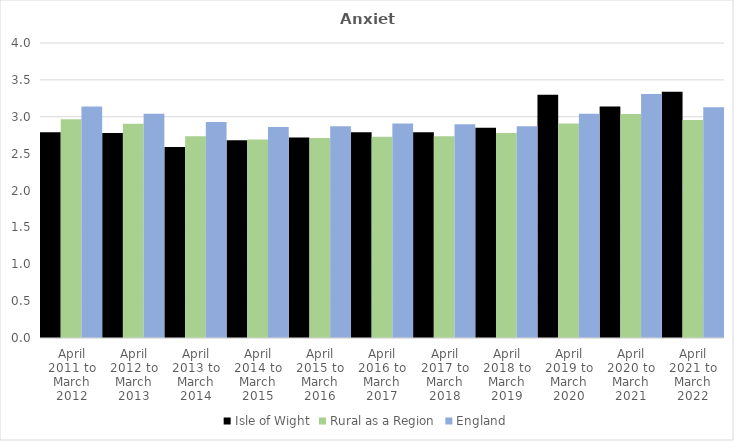
| Category | Isle of Wight | Rural as a Region | England |
|---|---|---|---|
| April 2011 to March 2012 | 2.79 | 2.967 | 3.14 |
| April 2012 to March 2013 | 2.78 | 2.904 | 3.04 |
| April 2013 to March 2014 | 2.59 | 2.734 | 2.93 |
| April 2014 to March 2015 | 2.68 | 2.691 | 2.86 |
| April 2015 to March 2016 | 2.72 | 2.711 | 2.87 |
| April 2016 to March 2017 | 2.79 | 2.729 | 2.91 |
| April 2017 to March 2018 | 2.79 | 2.736 | 2.9 |
| April 2018 to March 2019 | 2.85 | 2.78 | 2.87 |
| April 2019 to March 2020 | 3.3 | 2.908 | 3.04 |
| April 2020 to March 2021 | 3.14 | 3.036 | 3.31 |
| April 2021 to March 2022 | 3.34 | 2.956 | 3.13 |